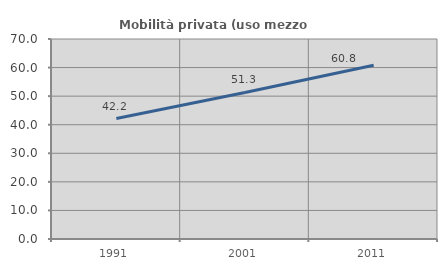
| Category | Mobilità privata (uso mezzo privato) |
|---|---|
| 1991.0 | 42.162 |
| 2001.0 | 51.282 |
| 2011.0 | 60.811 |